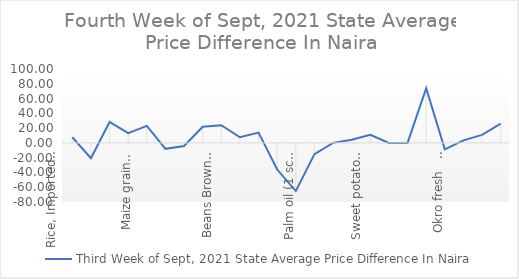
| Category | Third Week of Sept, 2021 |
|---|---|
| Rice, Imported, High Quality Sold loose  (1 mudu) | 7.609 |
| Rice, Agric Sold Loose(Low quality) imported  (1 mudu) | -20.652 |
| Rice Local, Sold Loose   (1 mudu) | 28.261 |
| Maize grain, white sold loose   (1 mudu) | 13.261 |
| Maize grain, yellow sold loose   (1 mudu) | 23.043 |
| Sorghum (Guinea Corn) white or brown, sold loose   (1 mudu) | -8.043 |
| millet (jero or maiwa) sold loose   (1 mudu) | -4.13 |
| Beans: white black eye. Sold loose   (1 mudu) | 21.739 |
| Beans Brown, sold loose  (1 mudu) | 23.913 |
| Soya Beans, sold loose    (1 mudu) | 7.609 |
| Gari White, sold loose  (1 mudu) | 13.913 |
| Gari Yellow, sold loose   (1 mudu) | -36.087 |
| Palm oil (1 schnap bottle) | -65.217 |
| Yam tuber (1 Medium Size) | -15.217 |
| Cassava tuber | 0 |
| Irish potato  (4 Litre rubber) | 4.348 |
| Sweet potato  (5 Medium Size) | 10.87 |
| Local live chicken  | 0 |
| Groundnut - shelled (fresh) | 0 |
| Tomato fresh   (4 Litre rubber) | 73.913 |
| Okro fresh     (1 mudu) | -8.696 |
| Okro dried    (1 mudu) | 3.478 |
| Onion   (4 Litre rubber) | 10.87 |
| Pepper fresh   (4 Litre rubber) | 26.087 |